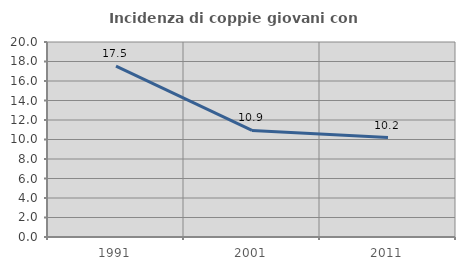
| Category | Incidenza di coppie giovani con figli |
|---|---|
| 1991.0 | 17.528 |
| 2001.0 | 10.934 |
| 2011.0 | 10.2 |